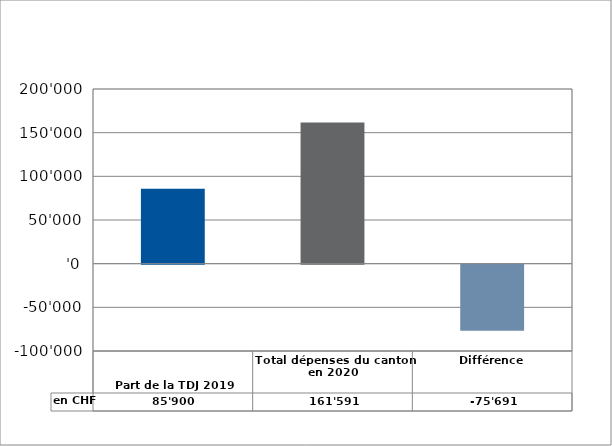
| Category | en CHF |
|---|---|
| 

Part de la TDJ 2019

 | 85900 |
| Total dépenses du canton en 2020 | 161591 |
| Différence | -75691 |